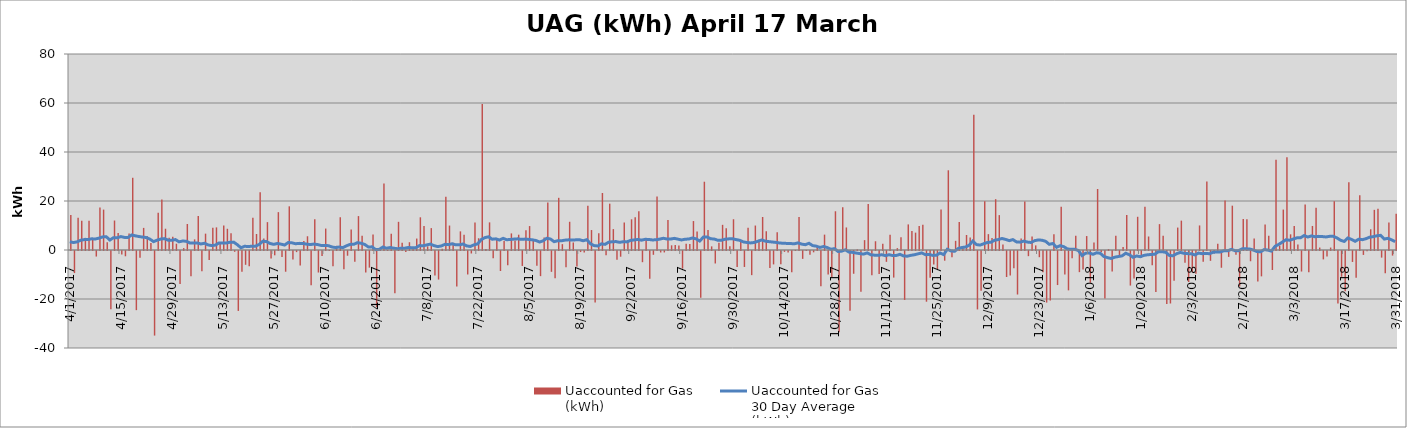
| Category | Uaccounted for Gas 
(kWh) |
|---|---|
| 0 | 14314397.979 |
| 1/1/00 | -9008049.104 |
| 1/2/00 | 13165005.851 |
| 1/3/00 | 11980030.176 |
| 1/4/00 | 4963693.543 |
| 1/5/00 | 11972930.131 |
| 1/6/00 | 4284250.066 |
| 1/7/00 | -2266328.699 |
| 1/8/00 | 17318408.419 |
| 1/9/00 | 16489319.449 |
| 1/10/00 | 3201171.629 |
| 1/11/00 | -23783680.639 |
| 1/12/00 | 12033013.284 |
| 1/13/00 | 6946572.891 |
| 1/14/00 | -1398838.285 |
| 1/15/00 | -2153865.698 |
| 1/16/00 | 6734254.676 |
| 1/17/00 | 29477749.879 |
| 1/18/00 | -24142769.097 |
| 1/19/00 | -2755644.542 |
| 1/20/00 | 9024930.444 |
| 1/21/00 | 5632530.276 |
| 1/22/00 | 2838749.558 |
| 1/23/00 | -34522813.79 |
| 1/24/00 | 15181134.834 |
| 1/25/00 | 20662476.267 |
| 1/26/00 | 8684996.991 |
| 1/27/00 | 5012383.723 |
| 1/28/00 | 5452507.869 |
| 1/29/00 | 2561051.633 |
| 1/30/00 | -13436860.743 |
| 1/31/00 | 770854.54 |
| 2/1/00 | 10612207.162 |
| 2/2/00 | -10261923.332 |
| 2/3/00 | 4332814.34 |
| 2/4/00 | 13850251.163 |
| 2/5/00 | -8300940.786 |
| 2/6/00 | 6675172.798 |
| 2/7/00 | -3719254.576 |
| 2/8/00 | 9099015.318 |
| 2/9/00 | 9231356.205 |
| 2/10/00 | 2527529.365 |
| 2/11/00 | 9999615.914 |
| 2/12/00 | 8661983.389 |
| 2/13/00 | 6830648.644 |
| 2/14/00 | -319114.718 |
| 2/15/00 | -24456047.192 |
| 2/16/00 | -8495750.168 |
| 2/17/00 | -5634607.278 |
| 2/18/00 | -6268354.247 |
| 2/19/00 | 13211001.835 |
| 2/20/00 | 6520097.209 |
| 2/21/00 | 23588602.917 |
| 2/22/00 | 4718145.012 |
| 2/23/00 | 11375251.275 |
| 2/24/00 | -3104793.773 |
| 2/25/00 | -1764474.555 |
| 2/26/00 | 15451647.886 |
| 2/27/00 | -2454022.028 |
| 2/28/00 | -8458312.167 |
| 2/28/00 | 17828687.778 |
| 3/1/00 | -3469631.667 |
| 3/2/00 | -459032.722 |
| 3/3/00 | -5878953.5 |
| 3/4/00 | 3650270.69 |
| 3/5/00 | 5610271.444 |
| 3/6/00 | -14008153.722 |
| 3/7/00 | 12502707.404 |
| 3/8/00 | -8779890.053 |
| 3/9/00 | -2033755.278 |
| 3/10/00 | 8749148.889 |
| 3/11/00 | 74535.055 |
| 3/12/00 | -6268696.086 |
| 3/13/00 | 1711995.233 |
| 3/14/00 | 13371017.897 |
| 3/15/00 | -7479050.502 |
| 3/16/00 | -1931622.864 |
| 3/17/00 | 8329410.667 |
| 3/18/00 | -4363870.417 |
| 3/19/00 | 13840852.722 |
| 3/20/00 | 5807261.786 |
| 3/21/00 | -8752585.532 |
| 3/22/00 | -6791869.773 |
| 3/23/00 | 6328984.786 |
| 3/24/00 | -22918268.069 |
| 3/25/00 | 485342.988 |
| 3/26/00 | 27146946.888 |
| 3/27/00 | -11687.243 |
| 3/28/00 | 6641294.108 |
| 3/29/00 | -17247992.71 |
| 3/30/00 | 11500662.269 |
| 3/31/00 | 2912391.861 |
| 4/1/00 | -404405.973 |
| 4/2/00 | 3172298.006 |
| 4/3/00 | 457996.32 |
| 4/4/00 | 4668359.005 |
| 4/5/00 | 13345374.235 |
| 4/6/00 | 9758939.698 |
| 4/7/00 | 1476730.319 |
| 4/8/00 | 8936574.199 |
| 4/9/00 | -9950012.081 |
| 4/10/00 | -11652063.324 |
| 4/11/00 | 539319.741 |
| 4/12/00 | 21740746.927 |
| 4/13/00 | 9982116.287 |
| 4/14/00 | 2991532.253 |
| 4/15/00 | -14452144.83 |
| 4/16/00 | 7608445.675 |
| 4/17/00 | 6256930.438 |
| 4/18/00 | -9582820.013 |
| 4/19/00 | -1008949.602 |
| 4/20/00 | 11177220.428 |
| 4/21/00 | 4790189.763 |
| 4/22/00 | 59561909.922 |
| 4/23/00 | 411090.629 |
| 4/24/00 | 11280590.945 |
| 4/25/00 | -2969818.113 |
| 4/26/00 | 4697753.803 |
| 4/27/00 | -8173841.186 |
| 4/28/00 | 3713431.881 |
| 4/29/00 | -5779907.79 |
| 4/30/00 | 6777965.118 |
| 5/1/00 | 3865953.096 |
| 5/2/00 | 6247170.111 |
| 5/3/00 | -6100717.944 |
| 5/4/00 | 8058456.828 |
| 5/5/00 | 9769336.508 |
| 5/6/00 | 4290130.784 |
| 5/7/00 | -6012797.889 |
| 5/8/00 | -10263489.861 |
| 5/9/00 | 5130784.778 |
| 5/10/00 | 19347697.433 |
| 5/11/00 | -8506058.217 |
| 5/12/00 | -11088056.226 |
| 5/13/00 | 21298584.61 |
| 5/14/00 | 2395089.26 |
| 5/15/00 | -6582631.685 |
| 5/16/00 | 11526046.869 |
| 5/17/00 | 3065624.512 |
| 5/18/00 | -6377372.544 |
| 5/19/00 | -427718.402 |
| 5/20/00 | -661129.118 |
| 5/21/00 | 18014997.432 |
| 5/22/00 | 8147500.63 |
| 5/23/00 | -21000124.156 |
| 5/24/00 | 6871303.039 |
| 5/25/00 | 23259331.63 |
| 5/26/00 | -1778904.424 |
| 5/27/00 | 18914307.327 |
| 5/28/00 | 8528695.975 |
| 5/29/00 | -3559892.096 |
| 5/30/00 | -2331214.465 |
| 5/31/00 | 11199561.978 |
| 6/1/00 | 4073971.844 |
| 6/2/00 | 12524234.75 |
| 6/3/00 | 13402267.563 |
| 6/4/00 | 15819304.335 |
| 6/5/00 | -4565295.769 |
| 6/6/00 | 4160880.173 |
| 6/7/00 | -11291858.67 |
| 6/8/00 | -1553729.667 |
| 6/9/00 | 21791668.516 |
| 6/10/00 | -605213.135 |
| 6/11/00 | -586589.777 |
| 6/12/00 | 12234946.602 |
| 6/13/00 | 1906386.321 |
| 6/14/00 | 2003831.341 |
| 6/15/00 | 1872748.242 |
| 6/16/00 | -7165082.108 |
| 6/17/00 | 2569216.621 |
| 6/18/00 | 2414710.385 |
| 6/19/00 | 11816761.701 |
| 6/20/00 | 7525037.176 |
| 6/21/00 | -19128984.832 |
| 6/22/00 | 27869538.365 |
| 6/23/00 | 8145679.278 |
| 6/24/00 | 1481253.159 |
| 6/25/00 | -5093882.112 |
| 6/26/00 | 2915495.471 |
| 6/27/00 | 10276742.333 |
| 6/28/00 | 8911532.169 |
| 6/29/00 | 1497062.032 |
| 6/30/00 | 12554488.73 |
| 7/1/00 | -6485436.644 |
| 7/2/00 | 3823072.851 |
| 7/3/00 | -6516054.715 |
| 7/4/00 | 9043365.697 |
| 7/5/00 | -9853088.686 |
| 7/6/00 | 9982055.168 |
| 7/7/00 | 4176249.508 |
| 7/8/00 | 13480566.206 |
| 7/9/00 | 7656648.682 |
| 7/10/00 | -6893459.472 |
| 7/11/00 | -5473824.25 |
| 7/12/00 | 7222282.114 |
| 7/13/00 | -5451179.321 |
| 7/14/00 | -360365.377 |
| 7/15/00 | -635175.282 |
| 7/16/00 | -8703686.534 |
| 7/17/00 | 50713.298 |
| 7/18/00 | 13498452.071 |
| 7/19/00 | -3209180.682 |
| 7/20/00 | 37937.636 |
| 7/21/00 | -1531223.082 |
| 7/22/00 | -542518.586 |
| 7/23/00 | 1381128.011 |
| 7/24/00 | -14429931.747 |
| 7/25/00 | 6273827.388 |
| 7/26/00 | -9568337.537 |
| 7/27/00 | -10631092.962 |
| 7/28/00 | 15810010.584 |
| 7/29/00 | -33182492.875 |
| 7/30/00 | 17435870.999 |
| 7/31/00 | 9202713.666 |
| 8/1/00 | -24349057.622 |
| 8/2/00 | -9289946.303 |
| 8/3/00 | 247623.524 |
| 8/4/00 | -16643882.506 |
| 8/5/00 | 4031815.8 |
| 8/6/00 | 18784912.812 |
| 8/7/00 | -9860922.269 |
| 8/8/00 | 3570291.163 |
| 8/9/00 | -9358516.536 |
| 8/10/00 | 2527234.585 |
| 8/11/00 | -4424857.323 |
| 8/12/00 | 6232661.05 |
| 8/13/00 | -10852350.179 |
| 8/14/00 | 761097.346 |
| 8/15/00 | 5192391.376 |
| 8/16/00 | -19963240.17 |
| 8/17/00 | 10444669.261 |
| 8/18/00 | 7754229.24 |
| 8/19/00 | 7087093.724 |
| 8/20/00 | 9791003.985 |
| 8/21/00 | 10286689.209 |
| 8/22/00 | -20696025.659 |
| 8/23/00 | -10927548.478 |
| 8/24/00 | -5494994.225 |
| 8/25/00 | -7370713.183 |
| 8/26/00 | 16500524.228 |
| 8/27/00 | -3959573.75 |
| 8/28/00 | 32536025.706 |
| 8/29/00 | -2517417.82 |
| 8/30/00 | 3740841.959 |
| 8/31/00 | 11384512.896 |
| 9/1/00 | 1649722.739 |
| 9/2/00 | 6117442.927 |
| 9/3/00 | 5057683.967 |
| 9/4/00 | 55199323.387 |
| 9/5/00 | -23847299.157 |
| 9/6/00 | -16265438.775 |
| 9/7/00 | 19924132.896 |
| 9/8/00 | 6474109.01 |
| 9/9/00 | 4924506.243 |
| 9/10/00 | 20741360.058 |
| 9/11/00 | 14241737.023 |
| 9/12/00 | 2219157.329 |
| 9/13/00 | -10622514.312 |
| 9/14/00 | -9996465.19 |
| 9/15/00 | -6998770.39 |
| 9/16/00 | -17760672.887 |
| 9/17/00 | 4675197.164 |
| 9/18/00 | 19775007.628 |
| 9/19/00 | -2107006.426 |
| 9/20/00 | 5489507.108 |
| 9/21/00 | 1878751.737 |
| 9/22/00 | -2531171.505 |
| 9/23/00 | -8712952.398 |
| 9/24/00 | -21051381.817 |
| 9/25/00 | -20212140.285 |
| 9/26/00 | 6397294.287 |
| 9/27/00 | -13893722.17 |
| 9/28/00 | 17624792.925 |
| 9/29/00 | -9542028.905 |
| 9/30/00 | -16061899.274 |
| 10/1/00 | -2973911.414 |
| 10/2/00 | 5819391.292 |
| 10/3/00 | -8630134.589 |
| 10/4/00 | -7584058.247 |
| 10/5/00 | 5692742.035 |
| 10/6/00 | -12970607.077 |
| 10/7/00 | 3103713.635 |
| 10/8/00 | 24895994.803 |
| 10/9/00 | -458446.582 |
| 10/10/00 | -19369546.074 |
| 10/11/00 | 391144.625 |
| 10/12/00 | -8393637.721 |
| 10/13/00 | 5816280.466 |
| 10/14/00 | -2131073.85 |
| 10/15/00 | 1200883.593 |
| 10/16/00 | 14297902.318 |
| 10/17/00 | -14105826.917 |
| 10/18/00 | -11191913.578 |
| 10/19/00 | 13555663.254 |
| 10/20/00 | -2736172.732 |
| 10/21/00 | 17634984.983 |
| 10/22/00 | 5514267.224 |
| 10/23/00 | -5816082.244 |
| 10/24/00 | -16685564.532 |
| 10/25/00 | 10559687.09 |
| 10/26/00 | 5801833.186 |
| 10/27/00 | -21658925.344 |
| 10/28/00 | -21423684.072 |
| 10/29/00 | -12113338.15 |
| 10/30/00 | 9154710.116 |
| 10/31/00 | 11988677.247 |
| 11/1/00 | -4786251.229 |
| 11/2/00 | -12660129.014 |
| 11/3/00 | -8682874.399 |
| 11/4/00 | -9267525.628 |
| 11/5/00 | 10022840.434 |
| 11/6/00 | -4350054.514 |
| 11/7/00 | 27976623.48 |
| 11/8/00 | -4016518.756 |
| 11/9/00 | -1003293.675 |
| 11/10/00 | 2554194.383 |
| 11/11/00 | -6839281.405 |
| 11/12/00 | 20212496.438 |
| 11/13/00 | -2401877.212 |
| 11/14/00 | 18092023.891 |
| 11/15/00 | -1532209.799 |
| 11/16/00 | -14490499.639 |
| 11/17/00 | 12657614.586 |
| 11/18/00 | 12566486.345 |
| 11/19/00 | -4184086.477 |
| 11/20/00 | 4724285.542 |
| 11/21/00 | -12441507.813 |
| 11/22/00 | -10350051.123 |
| 11/23/00 | 10396619.029 |
| 11/24/00 | 5786880.522 |
| 11/25/00 | -7761996.331 |
| 11/26/00 | 36860202.582 |
| 11/27/00 | 1790394.038 |
| 11/28/00 | 16501378.798 |
| 11/29/00 | 37815423.867 |
| 11/30/00 | 6396415.06 |
| 12/1/00 | 9830526.125 |
| 12/2/00 | 2231617.385 |
| 12/3/00 | -8380361.522 |
| 12/4/00 | 18581278.959 |
| 12/5/00 | -8711146.24 |
| 12/6/00 | 9811456.048 |
| 12/7/00 | 17227780.433 |
| 12/8/00 | 999668.529 |
| 12/9/00 | -3428148.502 |
| 12/10/00 | -2258975.533 |
| 12/11/00 | 1003159.84 |
| 12/12/00 | 19906432.127 |
| 12/13/00 | -21393497.837 |
| 12/14/00 | -10511737.909 |
| 12/15/00 | -16468986.505 |
| 12/16/00 | 27645246.72 |
| 12/17/00 | -4471109.403 |
| 12/18/00 | -10953338.461 |
| 12/19/00 | 22338285.26 |
| 12/20/00 | -1602854.602 |
| 12/21/00 | -150331.935 |
| 12/22/00 | 8469965.483 |
| 12/23/00 | 16387156.736 |
| 12/24/00 | 16798924.852 |
| 12/25/00 | -2700136.688 |
| 12/26/00 | -9084556.494 |
| 12/27/00 | 11199280.216 |
| 12/28/00 | -1876789.544 |
| 12/29/00 | 14758782.002 |